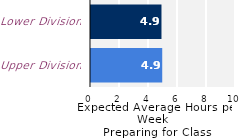
| Category | Series 0 |
|---|---|
| Upper Division | 4.912 |
| Lower Division | 4.86 |